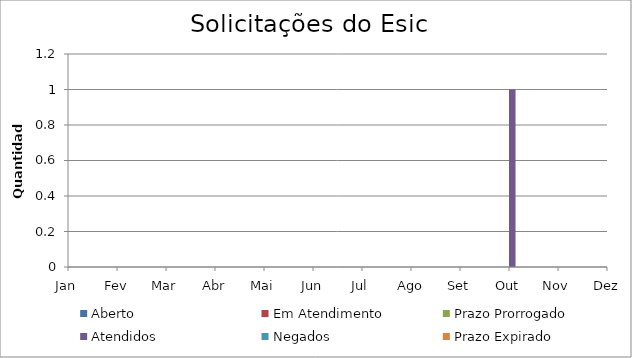
| Category | Aberto | Em Atendimento | Prazo Prorrogado | Atendidos | Negados | Prazo Expirado |
|---|---|---|---|---|---|---|
| Jan | 0 | 0 | 0 | 0 | 0 | 0 |
| Fev | 0 | 0 | 0 | 0 | 0 | 0 |
| Mar | 0 | 0 | 0 | 0 | 0 | 0 |
| Abr | 0 | 0 | 0 | 0 | 0 | 0 |
| Mai | 0 | 0 | 0 | 0 | 0 | 0 |
| Jun | 0 | 0 | 0 | 0 | 0 | 0 |
| Jul | 0 | 0 | 0 | 0 | 0 | 0 |
| Ago | 0 | 0 | 0 | 0 | 0 | 0 |
| Set | 0 | 0 | 0 | 0 | 0 | 0 |
| Out | 0 | 0 | 0 | 1 | 0 | 0 |
| Nov | 0 | 0 | 0 | 0 | 0 | 0 |
| Dez | 0 | 0 | 0 | 0 | 0 | 0 |